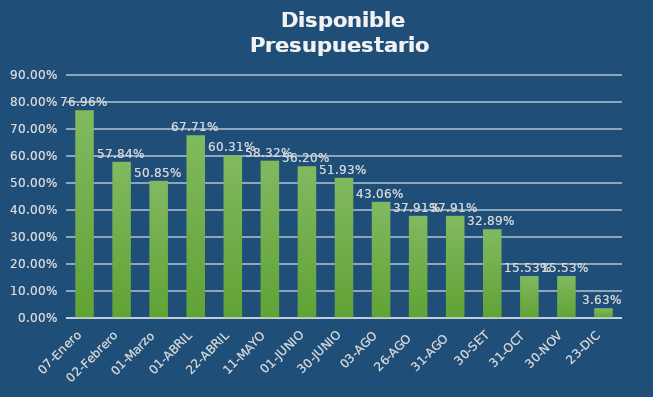
| Category | Disponible Presupuestario |
|---|---|
| 07-Enero | 0.77 |
| 02-Febrero | 0.578 |
| 01-Marzo | 0.508 |
| 01-ABRIL | 0.677 |
| 22-ABRIL | 0.603 |
| 11-MAYO | 0.583 |
| 01-JUNIO | 0.562 |
| 30-JUNIO | 0.519 |
| 03-AGO | 0.431 |
| 26-AGO  | 0.379 |
| 31-AGO  | 0.379 |
| 30-SET | 0.329 |
| 31-OCT | 0.155 |
| 30-NOV | 0.155 |
| 23-DIC | 0.036 |